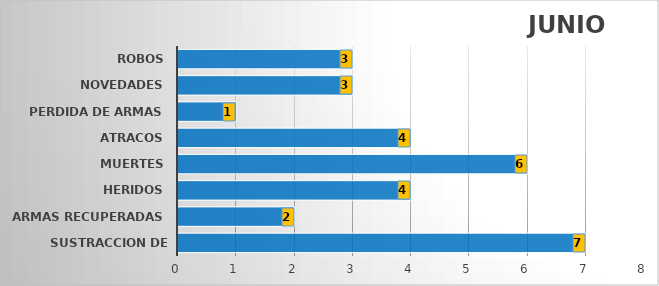
| Category | Series 1 |
|---|---|
| SUSTRACCION DE ARMAS | 7 |
| ARMAS RECUPERADAS | 2 |
| HERIDOS | 4 |
| MUERTES | 6 |
| ATRACOS | 4 |
| PERDIDA DE ARMAS | 1 |
| NOVEDADES | 3 |
| ROBOS | 3 |